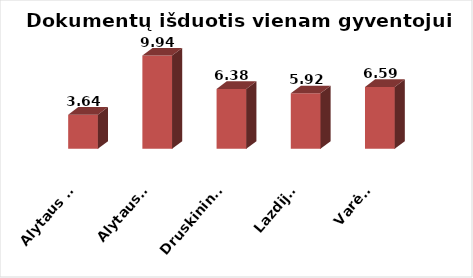
| Category | Series 0 |
|---|---|
| Alytaus m. | 3.637 |
| Alytaus r. | 9.938 |
| Druskininkai | 6.385 |
| Lazdijai | 5.918 |
| Varėna | 6.595 |